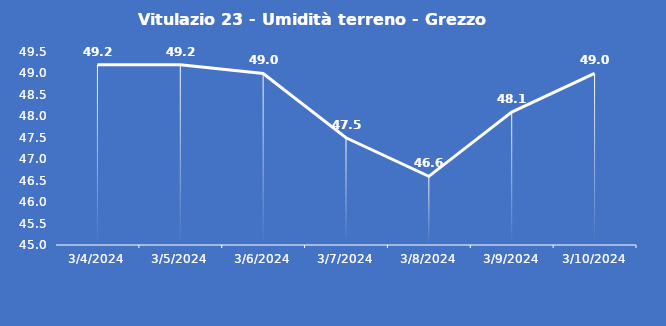
| Category | Vitulazio 23 - Umidità terreno - Grezzo (%VWC) |
|---|---|
| 3/4/24 | 49.2 |
| 3/5/24 | 49.2 |
| 3/6/24 | 49 |
| 3/7/24 | 47.5 |
| 3/8/24 | 46.6 |
| 3/9/24 | 48.1 |
| 3/10/24 | 49 |